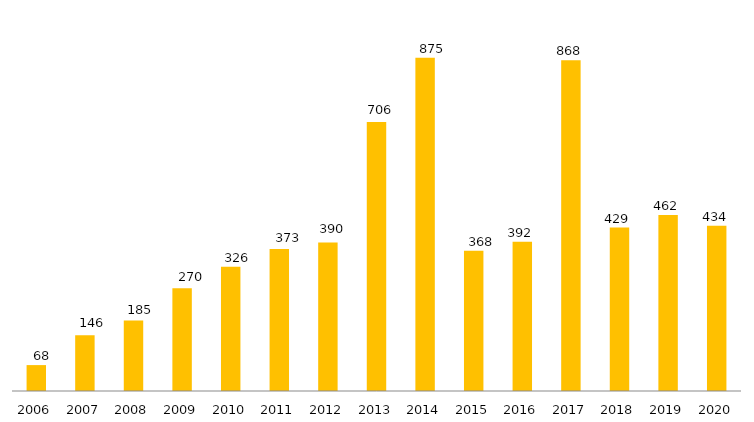
| Category | Pós - Graduação UFGD |
|---|---|
| 2006.0 | 68 |
| 2007.0 | 146 |
| 2008.0 | 185 |
| 2009.0 | 270 |
| 2010.0 | 326 |
| 2011.0 | 373 |
| 2012.0 | 390 |
| 2013.0 | 706 |
| 2014.0 | 875 |
| 2015.0 | 368 |
| 2016.0 | 392 |
| 2017.0 | 868 |
| 2018.0 | 429 |
| 2019.0 | 462 |
| 2020.0 | 434 |